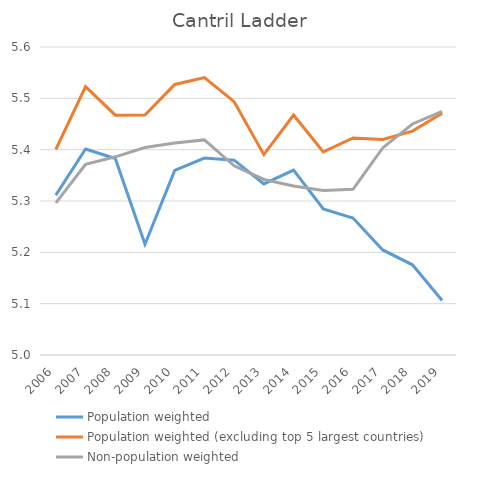
| Category | Population weighted | Population weighted (excluding top 5 largest countries) | Non-population weighted |
|---|---|---|---|
| 2006.0 | 5.311 | 5.401 | 5.296 |
| 2007.0 | 5.401 | 5.523 | 5.371 |
| 2008.0 | 5.383 | 5.467 | 5.386 |
| 2009.0 | 5.216 | 5.467 | 5.404 |
| 2010.0 | 5.36 | 5.527 | 5.413 |
| 2011.0 | 5.384 | 5.54 | 5.419 |
| 2012.0 | 5.38 | 5.493 | 5.369 |
| 2013.0 | 5.333 | 5.39 | 5.342 |
| 2014.0 | 5.36 | 5.468 | 5.329 |
| 2015.0 | 5.285 | 5.396 | 5.32 |
| 2016.0 | 5.267 | 5.423 | 5.323 |
| 2017.0 | 5.205 | 5.42 | 5.403 |
| 2018.0 | 5.176 | 5.436 | 5.45 |
| 2019.0 | 5.106 | 5.471 | 5.474 |